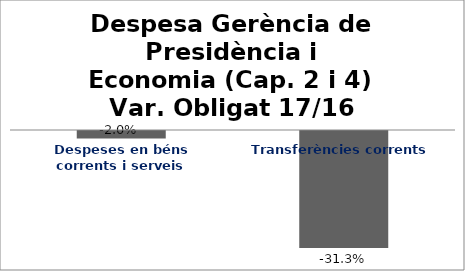
| Category | Series 0 |
|---|---|
| Despeses en béns corrents i serveis | -0.02 |
| Transferències corrents | -0.313 |